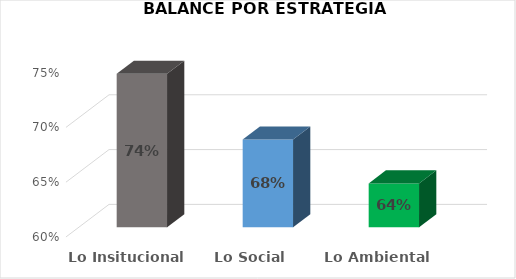
| Category | Series 0 |
|---|---|
| Lo Insitucional | 0.74 |
| Lo Social  | 0.68 |
| Lo Ambiental  | 0.64 |